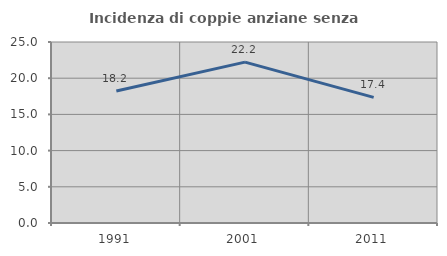
| Category | Incidenza di coppie anziane senza figli  |
|---|---|
| 1991.0 | 18.239 |
| 2001.0 | 22.222 |
| 2011.0 | 17.358 |